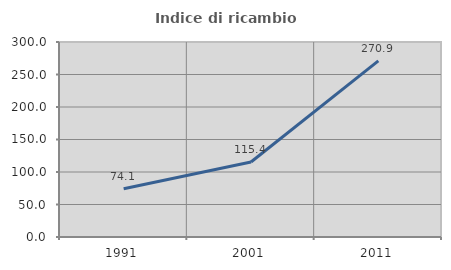
| Category | Indice di ricambio occupazionale  |
|---|---|
| 1991.0 | 74.119 |
| 2001.0 | 115.447 |
| 2011.0 | 270.909 |